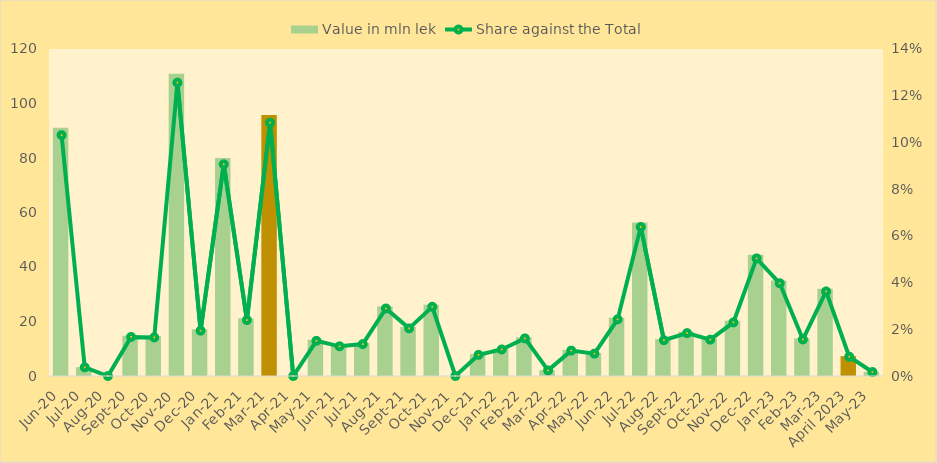
| Category | Value in mln lek |
|---|---|
| Jun-20 | 91.074 |
| Jul-20 | 3.258 |
| Aug-20 | 0 |
| Sep-20 | 14.772 |
| Oct-20 | 14.576 |
| Nov-20 | 110.908 |
| Dec-20 | 17.134 |
| Jan-21 | 80.04 |
| Feb-21 | 21.15 |
| Mar-21 | 95.778 |
| Apr-21 | 0 |
| May-21 | 13.298 |
| Jun-21 | 11.22 |
| Jul-21 | 12.06 |
| Aug-21 | 25.52 |
| Sep-21 | 18 |
| Oct-21 | 26.166 |
| Nov-21 | 0 |
| Dec-21 | 8 |
| Jan-22 | 10.04 |
| Feb-22 | 14.22 |
| Mar-22 | 2.12 |
| Apr-22 | 9.6 |
| May-22 | 8.46 |
| Jun-22 | 21.412 |
| Jul-22 | 56.376 |
| Aug-22 | 13.54 |
| Sep-22 | 16.22 |
| Oct-22 | 13.742 |
| Nov-22 | 20.26 |
| Dec-22 | 44.46 |
| Jan-23 | 35.06 |
| Feb-23 | 13.82 |
| Mar-23 | 31.98 |
| April 2023 | 7.28 |
| May-23 | 1.5 |